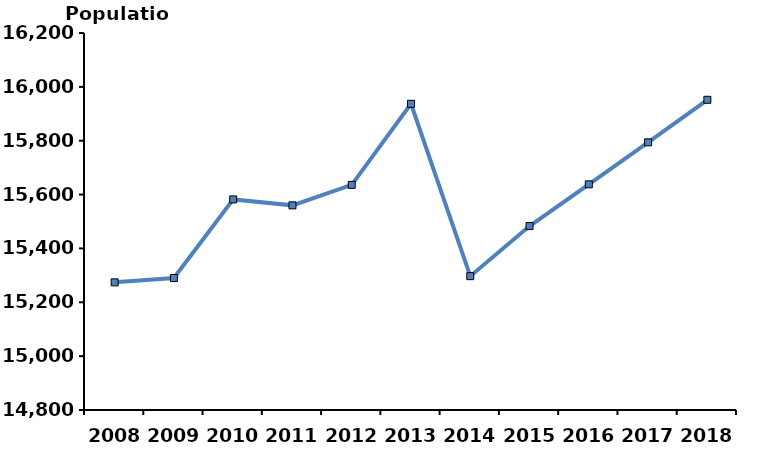
| Category | population |
|---|---|
| 0 | 15274 |
| 1 | 15290 |
| 2 | 15582 |
| 3 | 15560 |
| 4 | 15636 |
| 5 | 15937 |
| 6 | 15297 |
| 7 | 15483 |
| 8 | 15638 |
| 9 | 15794 |
| 10 | 15952 |